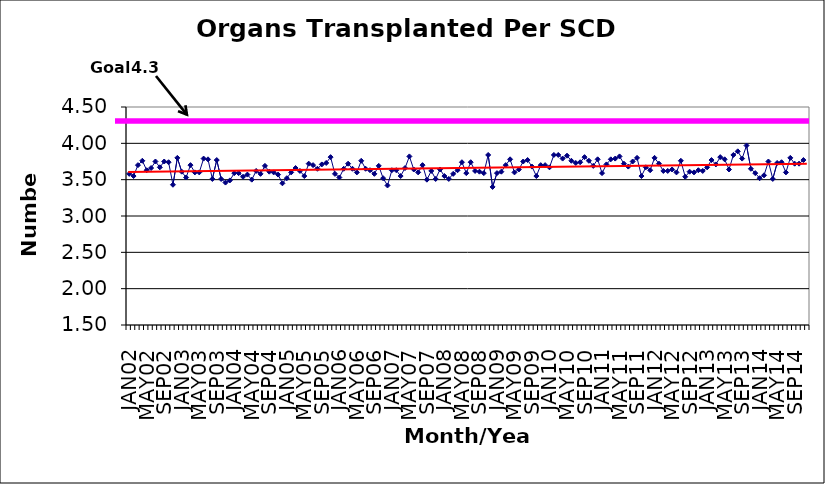
| Category | Series 0 |
|---|---|
| JAN02 | 3.58 |
| FEB02 | 3.55 |
| MAR02 | 3.7 |
| APR02 | 3.76 |
| MAY02 | 3.63 |
| JUN02 | 3.66 |
| JUL02 | 3.75 |
| AUG02 | 3.67 |
| SEP02 | 3.75 |
| OCT02 | 3.74 |
| NOV02 | 3.43 |
| DEC02 | 3.8 |
| JAN03 | 3.61 |
| FEB03 | 3.53 |
| MAR03 | 3.7 |
| APR03 | 3.6 |
| MAY03 | 3.6 |
| JUN03 | 3.79 |
| JUL03 | 3.78 |
| AUG03 | 3.51 |
| SEP03 | 3.77 |
| OCT03 | 3.51 |
| NOV03 | 3.46 |
| DEC03 | 3.49 |
| JAN04 | 3.59 |
| FEB04 | 3.59 |
| MAR04 | 3.54 |
| APR04 | 3.57 |
| MAY04 | 3.5 |
| JUN04 | 3.62 |
| JUL04 | 3.58 |
| AUG04 | 3.69 |
| SEP04 | 3.61 |
| OCT04 | 3.6 |
| NOV04 | 3.57 |
| DEC04 | 3.45 |
| JAN05 | 3.52 |
| FEB05 | 3.6 |
| MAR05 | 3.66 |
| APR05 | 3.62 |
| MAY05 | 3.55 |
| JUN05 | 3.72 |
| JUL05 | 3.7 |
| AUG05 | 3.65 |
| SEP05 | 3.71 |
| OCT05 | 3.73 |
| NOV05 | 3.81 |
| DEC05 | 3.58 |
| JAN06 | 3.53 |
| FEB06 | 3.65 |
| MAR06 | 3.72 |
| APR06 | 3.65 |
| MAY06 | 3.6 |
| JUN06 | 3.76 |
| JUL06 | 3.65 |
| AUG06 | 3.63 |
| SEP06 | 3.58 |
| OCT06 | 3.69 |
| NOV06 | 3.52 |
| DEC06 | 3.42 |
| JAN07 | 3.63 |
| FEB07 | 3.63 |
| MAR07 | 3.55 |
| APR07 | 3.66 |
| MAY07 | 3.82 |
| JUN07 | 3.64 |
| JUL07 | 3.6 |
| AUG07 | 3.7 |
| SEP07 | 3.5 |
| OCT07 | 3.62 |
| NOV07 | 3.51 |
| DEC07 | 3.64 |
| JAN08 | 3.55 |
| FEB08 | 3.51 |
| MAR08 | 3.58 |
| APR08 | 3.63 |
| MAY08 | 3.74 |
| JUN08 | 3.59 |
| JUL08 | 3.74 |
| AUG08 | 3.62 |
| SEP08 | 3.61 |
| OCT08 | 3.59 |
| NOV08 | 3.84 |
| DEC08 | 3.4 |
| JAN09 | 3.59 |
| FEB09 | 3.61 |
| MAR09 | 3.7 |
| APR09 | 3.78 |
| MAY09 | 3.6 |
| JUN09 | 3.64 |
| JUL09 | 3.75 |
| AUG09 | 3.77 |
| SEP09 | 3.68 |
| OCT09 | 3.55 |
| NOV09 | 3.7 |
| DEC09 | 3.7 |
| JAN10 | 3.67 |
| FEB10 | 3.84 |
| MAR10 | 3.84 |
| APR10 | 3.79 |
| MAY10 | 3.83 |
| JUN10 | 3.76 |
| JUL10 | 3.73 |
| AUG10 | 3.74 |
| SEP10 | 3.81 |
| OCT10 | 3.76 |
| NOV10 | 3.69 |
| DEC10 | 3.78 |
| JAN11 | 3.59 |
| FEB11 | 3.71 |
| MAR11 | 3.78 |
| APR11 | 3.79 |
| MAY11 | 3.82 |
| JUN11 | 3.72 |
| JUL11 | 3.68 |
| AUG11 | 3.75 |
| SEP11 | 3.8 |
| OCT11 | 3.55 |
| NOV11 | 3.67 |
| DEC11 | 3.63 |
| JAN12 | 3.8 |
| FEB12 | 3.72 |
| MAR12 | 3.62 |
| APR12 | 3.62 |
| MAY12 | 3.64 |
| JUN12 | 3.6 |
| JUL12 | 3.76 |
| AUG12 | 3.54 |
| SEP12 | 3.61 |
| OCT12 | 3.6 |
| NOV12 | 3.63 |
| DEC12 | 3.62 |
| JAN13 | 3.67 |
| FEB13 | 3.77 |
| MAR13 | 3.71 |
| APR13 | 3.81 |
| MAY13 | 3.78 |
| JUN13 | 3.64 |
| JUL13 | 3.84 |
| AUG13 | 3.89 |
| SEP13 | 3.79 |
| OCT13 | 3.97 |
| NOV13 | 3.65 |
| DEC13 | 3.59 |
| JAN14 | 3.52 |
| FEB14 | 3.56 |
| MAR14 | 3.75 |
| APR14 | 3.51 |
| MAY14 | 3.73 |
| JUN14 | 3.74 |
| JUL14 | 3.6 |
| AUG14 | 3.8 |
| SEP14 | 3.72 |
| OCT14 | 3.72 |
| NOV14 | 3.77 |